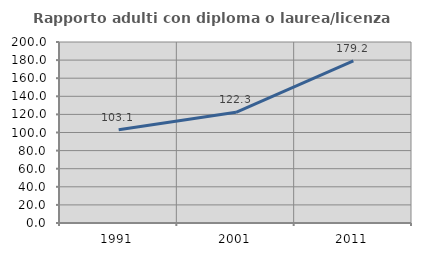
| Category | Rapporto adulti con diploma o laurea/licenza media  |
|---|---|
| 1991.0 | 103.099 |
| 2001.0 | 122.265 |
| 2011.0 | 179.167 |